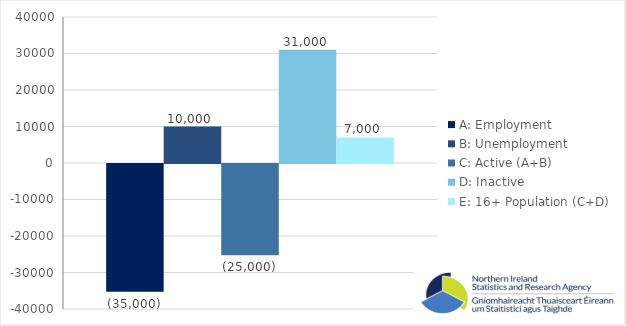
| Category | A: Employment | B: Unemployment | C: Active (A+B) | D: Inactive | E: 16+ Population (C+D) |
|---|---|---|---|---|---|
| 0 | -35000 | 10000 | -25000 | 31000 | 7000 |